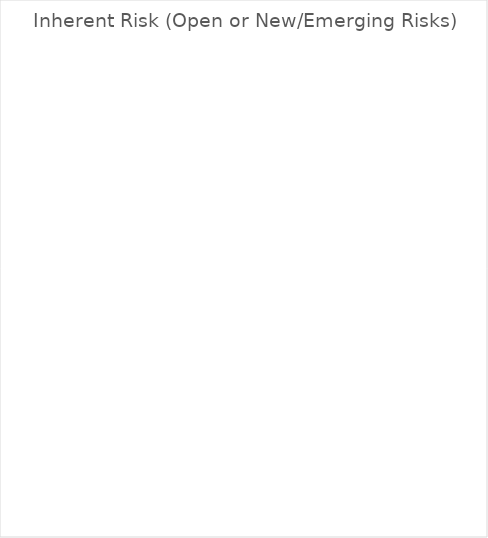
| Category | Inherent Risks by Severity (Open or New/Emerging) |
|---|---|
| Minor | 0 |
| Moderate | 0 |
| Major | 0 |
| Severe | 0 |